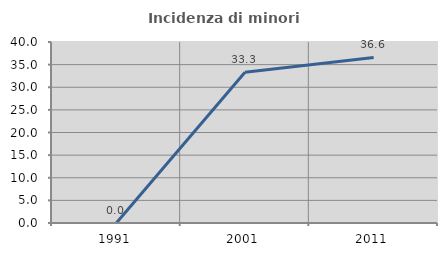
| Category | Incidenza di minori stranieri |
|---|---|
| 1991.0 | 0 |
| 2001.0 | 33.333 |
| 2011.0 | 36.585 |